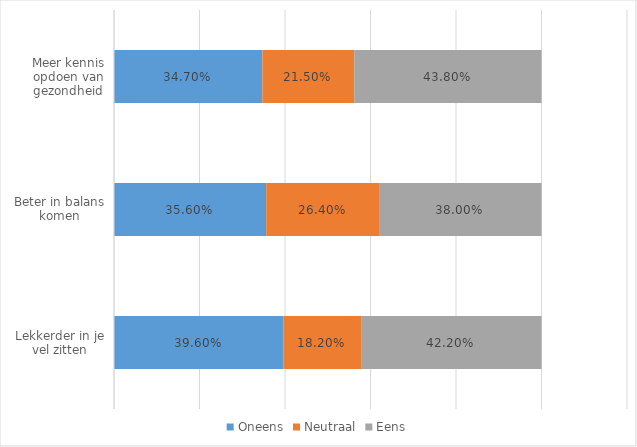
| Category | Oneens | Neutraal | Eens |
|---|---|---|---|
| Lekkerder in je vel zitten | 0.396 | 0.182 | 0.422 |
| Beter in balans komen | 0.356 | 0.264 | 0.38 |
| Meer kennis opdoen van gezondheid | 0.347 | 0.215 | 0.438 |